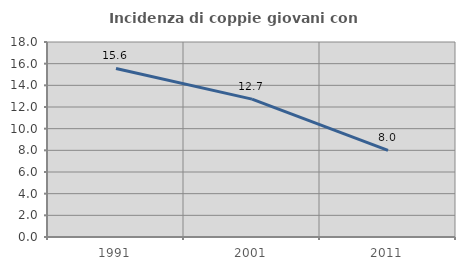
| Category | Incidenza di coppie giovani con figli |
|---|---|
| 1991.0 | 15.556 |
| 2001.0 | 12.727 |
| 2011.0 | 8 |